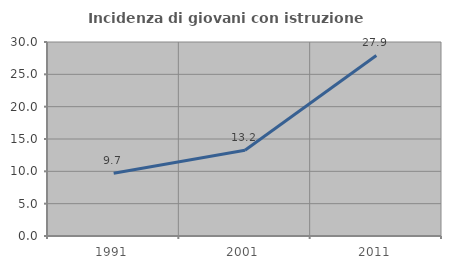
| Category | Incidenza di giovani con istruzione universitaria |
|---|---|
| 1991.0 | 9.699 |
| 2001.0 | 13.249 |
| 2011.0 | 27.917 |